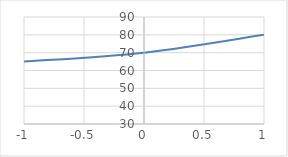
| Category | Series 0 |
|---|---|
| -1.0 | 65 |
| 0.0 | 70 |
| 1.0 | 80 |